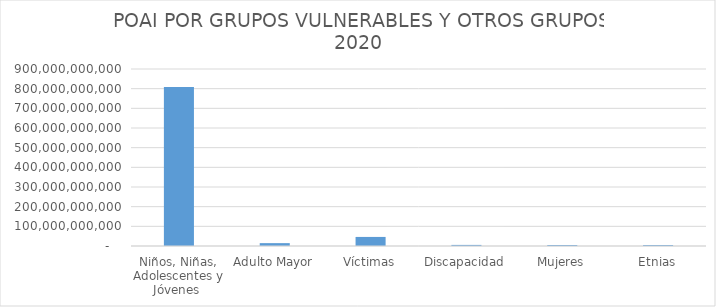
| Category | Series 0 |
|---|---|
| Niños, Niñas, Adolescentes y Jóvenes  | 808524830489 |
| Adulto Mayor | 14573603705 |
| Víctimas | 46087318271 |
| Discapacidad | 5561658900 |
| Mujeres | 5124250005 |
| Etnias | 4919254556 |